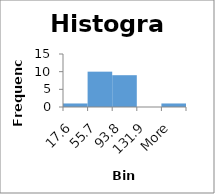
| Category | Frequency |
|---|---|
| 17,6 | 1 |
| 55,7 | 10 |
| 93,8 | 9 |
| 131,9 | 0 |
| More | 1 |